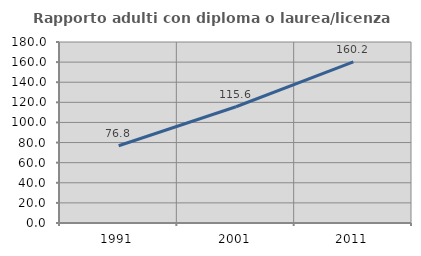
| Category | Rapporto adulti con diploma o laurea/licenza media  |
|---|---|
| 1991.0 | 76.781 |
| 2001.0 | 115.593 |
| 2011.0 | 160.198 |